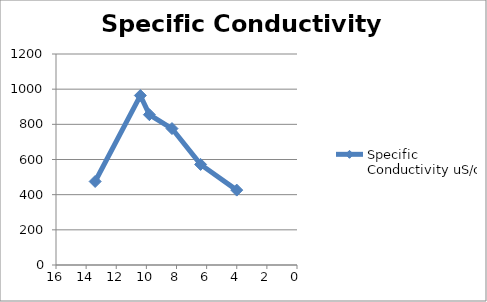
| Category | Specific Conductivity uS/cm |
|---|---|
| 13.4 | 475 |
| 10.4 | 964 |
| 9.8 | 855 |
| 8.3 | 776 |
| 6.4 | 572 |
| 4.0 | 426 |